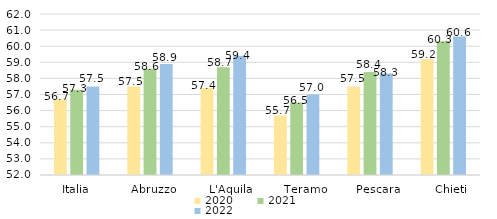
| Category | 2020 | 2021 | 2022 |
|---|---|---|---|
| Italia | 56.7 | 57.3 | 57.5 |
|   Abruzzo | 57.5 | 58.6 | 58.9 |
|     L'Aquila | 57.4 | 58.7 | 59.4 |
|     Teramo | 55.7 | 56.5 | 57 |
|     Pescara | 57.5 | 58.4 | 58.3 |
|     Chieti | 59.2 | 60.3 | 60.6 |